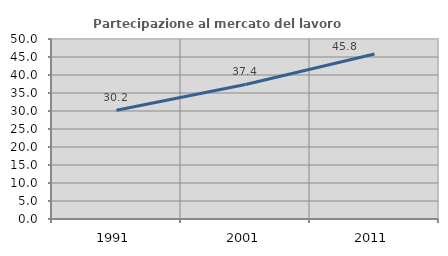
| Category | Partecipazione al mercato del lavoro  femminile |
|---|---|
| 1991.0 | 30.192 |
| 2001.0 | 37.363 |
| 2011.0 | 45.847 |